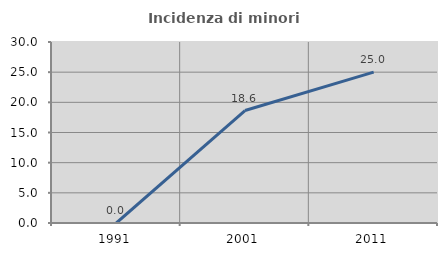
| Category | Incidenza di minori stranieri |
|---|---|
| 1991.0 | 0 |
| 2001.0 | 18.644 |
| 2011.0 | 25 |